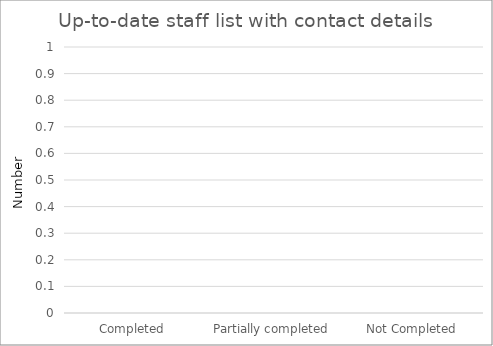
| Category | Up-to-date staff list with contact details |
|---|---|
| Completed | 0 |
| Partially completed | 0 |
| Not Completed | 0 |